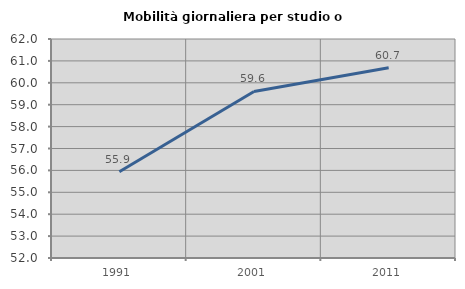
| Category | Mobilità giornaliera per studio o lavoro |
|---|---|
| 1991.0 | 55.936 |
| 2001.0 | 59.604 |
| 2011.0 | 60.688 |